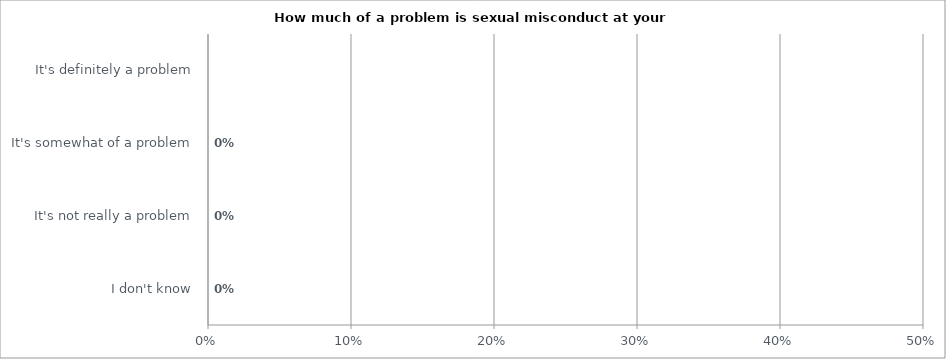
| Category | Percent |
|---|---|
| I don't know | 0 |
| It's not really a problem | 0 |
| It's somewhat of a problem | 0 |
| It's definitely a problem | 0 |